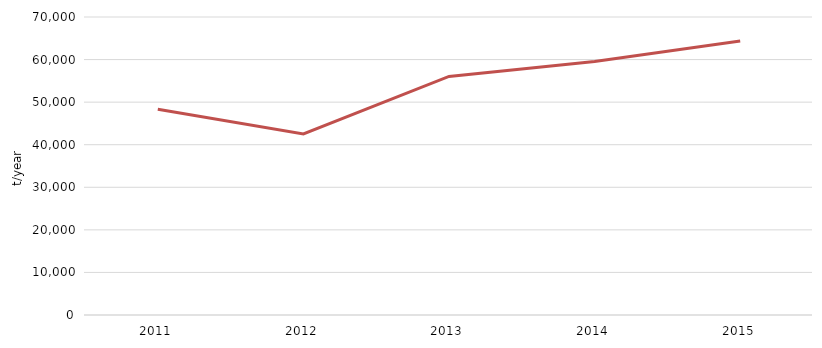
| Category | packaging released on market |
|---|---|
| 2011.0 | 48340.83 |
| 2012.0 | 42515.62 |
| 2013.0 | 56043.73 |
| 2014.0 | 59572.83 |
| 2015.0 | 64369.48 |